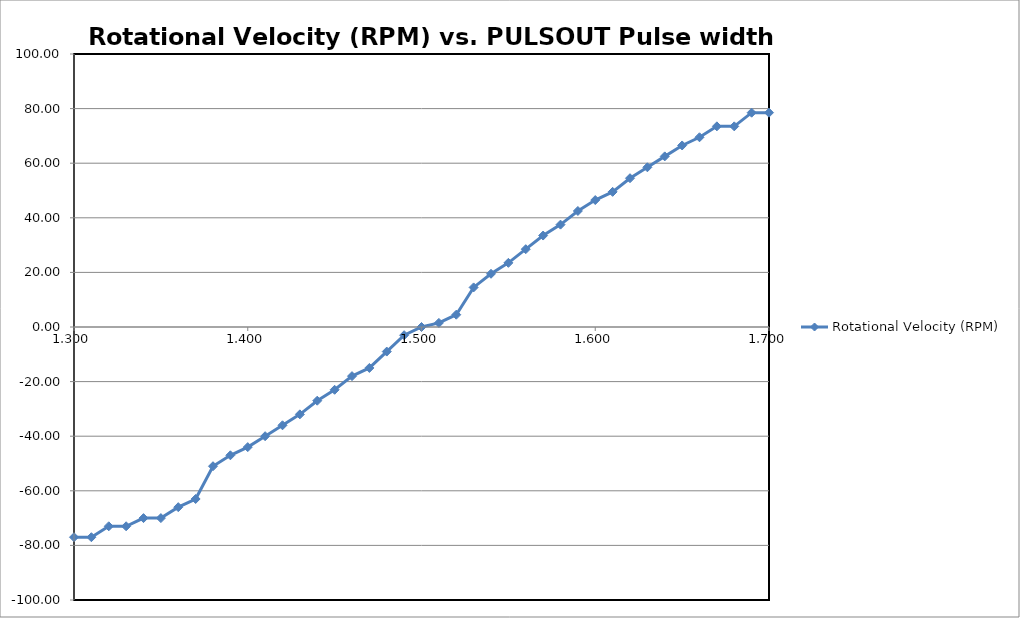
| Category | Rotational Velocity (RPM) |
|---|---|
| 1.3 | -77 |
| 1.31 | -77 |
| 1.32 | -73 |
| 1.33 | -73 |
| 1.34 | -70 |
| 1.35 | -70 |
| 1.36 | -66 |
| 1.37 | -63 |
| 1.38 | -51 |
| 1.39 | -47 |
| 1.4 | -44 |
| 1.41 | -40 |
| 1.42 | -36 |
| 1.43 | -32 |
| 1.44 | -27 |
| 1.45 | -23 |
| 1.46 | -18 |
| 1.47 | -15 |
| 1.48 | -9 |
| 1.49 | -3 |
| 1.5 | 0 |
| 1.51 | 1.5 |
| 1.52 | 4.5 |
| 1.53 | 14.5 |
| 1.54 | 19.5 |
| 1.55 | 23.5 |
| 1.56 | 28.5 |
| 1.57 | 33.5 |
| 1.58 | 37.5 |
| 1.59 | 42.5 |
| 1.6 | 46.5 |
| 1.61 | 49.5 |
| 1.62 | 54.5 |
| 1.63 | 58.5 |
| 1.64 | 62.5 |
| 1.65 | 66.5 |
| 1.66 | 69.5 |
| 1.67 | 73.5 |
| 1.68 | 73.5 |
| 1.69 | 78.5 |
| 1.7 | 78.5 |